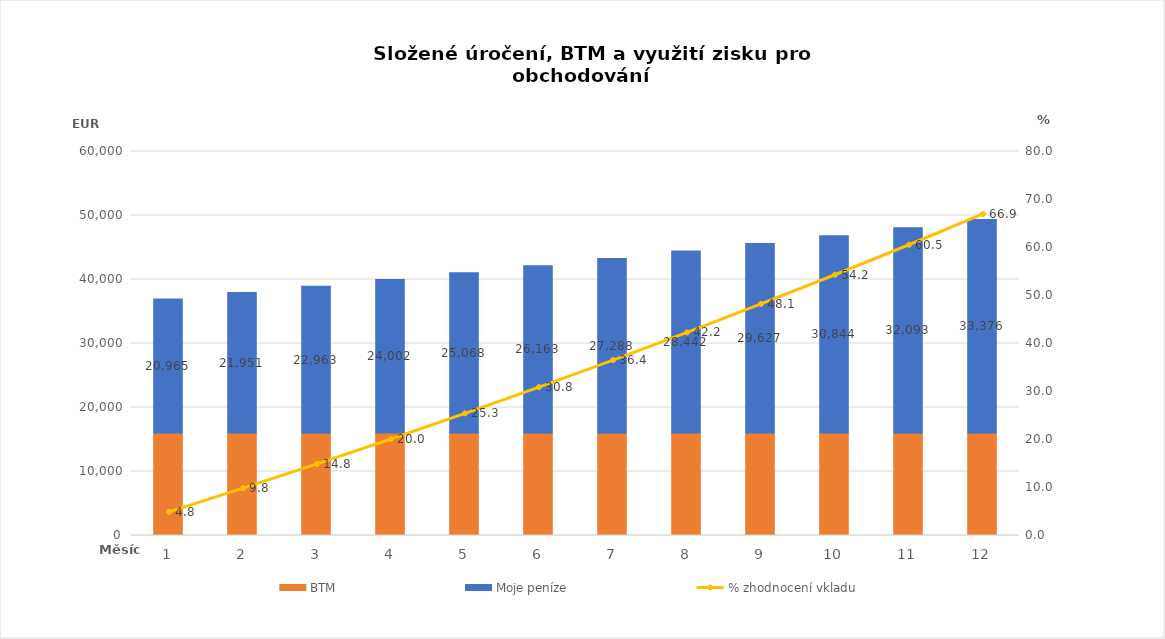
| Category | BTM | Moje peníze |
|---|---|---|
| 1.0 | 16000 | 20964.8 |
| 2.0 | 16000 | 21950.528 |
| 3.0 | 16000 | 22962.542 |
| 4.0 | 16000 | 24001.543 |
| 5.0 | 16000 | 25068.251 |
| 6.0 | 16000 | 26163.404 |
| 7.0 | 16000 | 27287.762 |
| 8.0 | 16000 | 28442.102 |
| 9.0 | 16000 | 29627.225 |
| 10.0 | 16000 | 30843.951 |
| 11.0 | 16000 | 32093.123 |
| 12.0 | 16000 | 33375.606 |